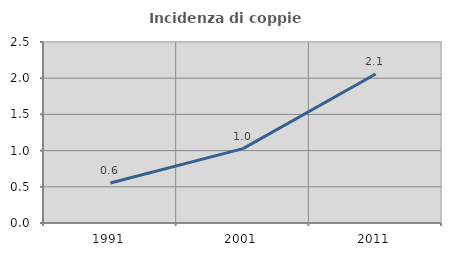
| Category | Incidenza di coppie miste |
|---|---|
| 1991.0 | 0.553 |
| 2001.0 | 1.027 |
| 2011.0 | 2.058 |